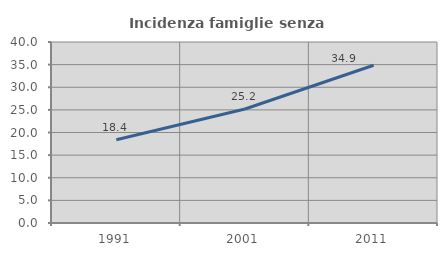
| Category | Incidenza famiglie senza nuclei |
|---|---|
| 1991.0 | 18.396 |
| 2001.0 | 25.188 |
| 2011.0 | 34.868 |